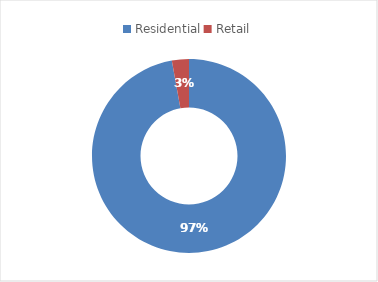
| Category | Series 0 |
|---|---|
| Residential | 171362 |
| Retail | 5000 |